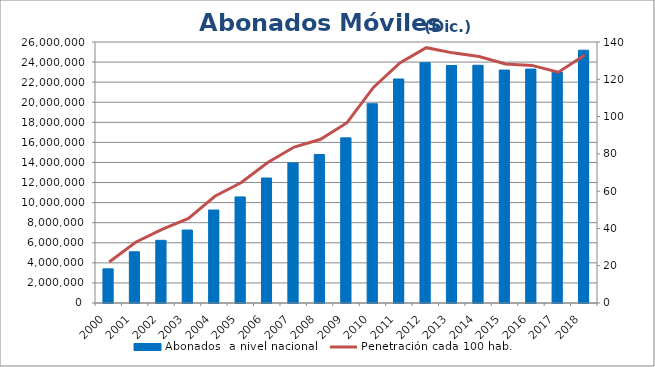
| Category | Abonados  a nivel nacional  |
|---|---|
| 2000.0 | 3401525 |
| 2001.0 | 5100783 |
| 2002.0 | 6244310 |
| 2003.0 | 7268281 |
| 2004.0 | 9261385 |
| 2005.0 | 10569572 |
| 2006.0 | 12450801 |
| 2007.0 | 13955202 |
| 2008.0 | 14796593 |
| 2009.0 | 16450223 |
| 2010.0 | 19852242 |
| 2011.0 | 22315248 |
| 2012.0 | 23940973 |
| 2013.0 | 23661339 |
| 2014.0 | 23680718 |
| 2015.0 | 23206353 |
| 2016.0 | 23302603 |
| 2017.0 | 23013147 |
| 2018.0 | 25178981 |